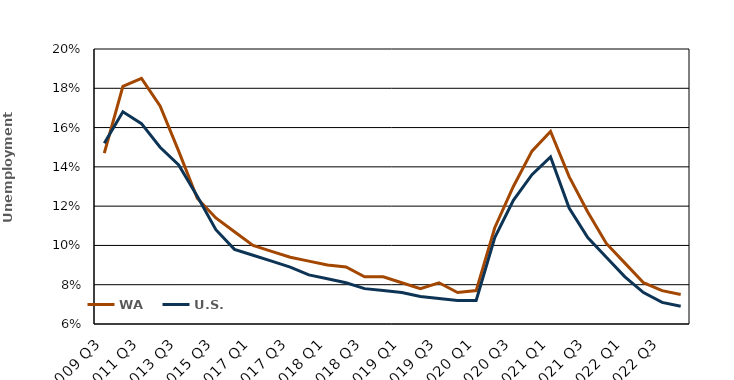
| Category | WA | U.S. |
|---|---|---|
| 2009 Q3 | 0.147 | 0.152 |
| 2010 Q3 | 0.181 | 0.168 |
| 2011 Q3 | 0.185 | 0.162 |
| 2012 Q3 | 0.171 | 0.15 |
| 2013 Q3 | 0.148 | 0.141 |
| 2014 Q3 | 0.124 | 0.125 |
| 2015 Q3 | 0.114 | 0.108 |
| 2016 Q3 | 0.107 | 0.098 |
| 2017 Q1 | 0.1 | 0.095 |
| 2017 Q2 | 0.097 | 0.092 |
| 2017 Q3 | 0.094 | 0.089 |
| 2017 Annual | 0.092 | 0.085 |
| 2018 Q1 | 0.09 | 0.083 |
| 2018 Q2 | 0.089 | 0.081 |
| 2018 Q3 | 0.084 | 0.078 |
| 2018 Annual | 0.084 | 0.077 |
| 2019 Q1 | 0.081 | 0.076 |
| 2019 Q2 | 0.078 | 0.074 |
| 2019 Q3 | 0.081 | 0.073 |
| 2019 Annual | 0.076 | 0.072 |
| 2020 Q1 | 0.077 | 0.072 |
| 2020 Q2 | 0.109 | 0.104 |
| 2020 Q3 | 0.13 | 0.123 |
| 2020 Annual | 0.148 | 0.136 |
| 2021 Q1 | 0.158 | 0.145 |
| 2021 Q2 | 0.135 | 0.119 |
| 2021 Q3 | 0.117 | 0.104 |
| 2021 Annual | 0.101 | 0.094 |
| 2022 Q1 | 0.091 | 0.084 |
| 2022 Q2 | 0.081 | 0.076 |
| 2022 Q3 | 0.077 | 0.071 |
| 2022 Annual | 0.075 | 0.069 |